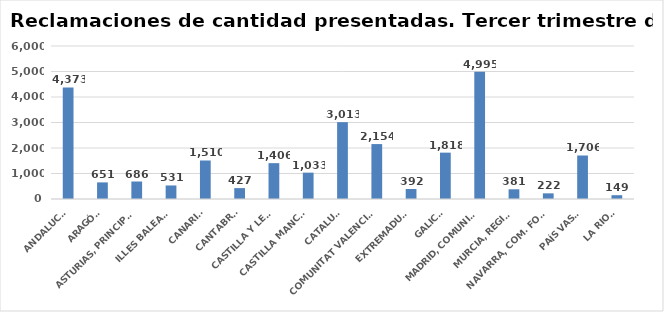
| Category | Series 0 |
|---|---|
| ANDALUCÍA | 4373 |
| ARAGÓN | 651 |
| ASTURIAS, PRINCIPADO | 686 |
| ILLES BALEARS | 531 |
| CANARIAS | 1510 |
| CANTABRIA | 427 |
| CASTILLA Y LEÓN | 1406 |
| CASTILLA MANCHA | 1033 |
| CATALUÑA | 3013 |
| COMUNITAT VALENCIANA | 2154 |
| EXTREMADURA | 392 |
| GALICIA | 1818 |
| MADRID, COMUNIDAD | 4995 |
| MURCIA, REGIÓN | 381 |
| NAVARRA, COM. FORAL | 222 |
| PAÍS VASCO | 1706 |
| LA RIOJA | 149 |